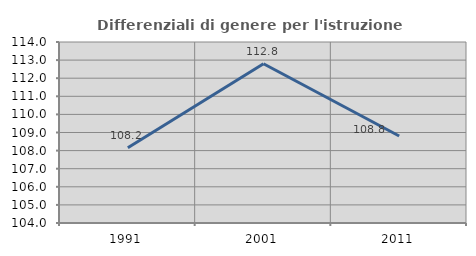
| Category | Differenziali di genere per l'istruzione superiore |
|---|---|
| 1991.0 | 108.154 |
| 2001.0 | 112.799 |
| 2011.0 | 108.806 |